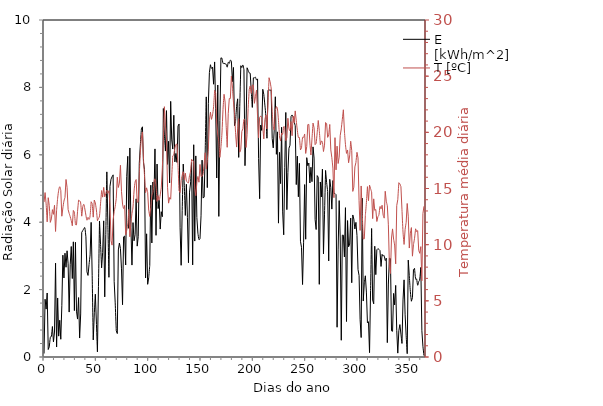
| Category | E |
|---|---|
| 1.0 | 0.103 |
| 2.0 | 1.714 |
| 3.0 | 1.421 |
| 4.0 | 1.9 |
| 5.0 | 0.222 |
| 6.0 | 0.301 |
| 7.0 | 0.579 |
| 8.0 | 0.615 |
| 9.0 | 0.905 |
| 10.0 | 0.449 |
| 11.0 | 0.74 |
| 12.0 | 2.784 |
| 13.0 | 0.296 |
| 14.0 | 1.752 |
| 15.0 | 0.619 |
| 16.0 | 1.091 |
| 17.0 | 0.527 |
| 18.0 | 1.522 |
| 19.0 | 3.022 |
| 20.0 | 2.345 |
| 21.0 | 3.08 |
| 22.0 | 2.663 |
| 23.0 | 3.152 |
| 24.0 | 2.765 |
| 25.0 | 1.333 |
| 26.0 | 2.736 |
| 27.0 | 3.279 |
| 28.0 | 2.328 |
| 29.0 | 3.418 |
| 30.0 | 1.377 |
| 31.0 | 3.404 |
| 32.0 | 1.36 |
| 33.0 | 1.125 |
| 34.0 | 1.764 |
| 35.0 | 0.563 |
| 36.0 | 1.277 |
| 37.0 | 3.698 |
| 38.0 | 3.753 |
| 39.0 | 3.804 |
| 40.0 | 3.83 |
| 41.0 | 3.566 |
| 42.0 | 2.527 |
| 43.0 | 2.421 |
| 44.0 | 2.741 |
| 45.0 | 3.03 |
| 46.0 | 3.994 |
| 47.0 | 2.412 |
| 48.0 | 0.507 |
| 49.0 | 1.278 |
| 50.0 | 1.864 |
| 51.0 | 1.039 |
| 52.0 | 0.153 |
| 53.0 | 2.093 |
| 54.0 | 4.034 |
| 55.0 | 3.34 |
| 56.0 | 2.646 |
| 57.0 | 3.095 |
| 58.0 | 4.04 |
| 59.0 | 1.784 |
| 60.0 | 3.638 |
| 61.0 | 5.493 |
| 62.0 | 3.906 |
| 63.0 | 2.365 |
| 64.0 | 5.064 |
| 65.0 | 5.274 |
| 66.0 | 5.35 |
| 67.0 | 5.405 |
| 68.0 | 2.245 |
| 69.0 | 1.607 |
| 70.0 | 0.778 |
| 71.0 | 0.695 |
| 72.0 | 3.177 |
| 73.0 | 3.383 |
| 74.0 | 3.219 |
| 75.0 | 2.616 |
| 76.0 | 1.551 |
| 77.0 | 3.566 |
| 78.0 | 3.588 |
| 79.0 | 2.73 |
| 80.0 | 5.361 |
| 81.0 | 5.955 |
| 82.0 | 3.816 |
| 83.0 | 6.203 |
| 84.0 | 3.836 |
| 85.0 | 2.727 |
| 86.0 | 3.988 |
| 87.0 | 3.448 |
| 88.0 | 3.626 |
| 89.0 | 4.694 |
| 90.0 | 3.29 |
| 91.0 | 3.572 |
| 92.0 | 5.747 |
| 93.0 | 6.291 |
| 94.0 | 6.764 |
| 95.0 | 6.831 |
| 96.0 | 5.776 |
| 97.0 | 5.557 |
| 98.0 | 2.344 |
| 99.0 | 3.655 |
| 100.0 | 2.157 |
| 101.0 | 2.354 |
| 102.0 | 2.718 |
| 103.0 | 5.098 |
| 104.0 | 3.384 |
| 105.0 | 5.191 |
| 106.0 | 4.671 |
| 107.0 | 6.175 |
| 108.0 | 3.61 |
| 109.0 | 5.725 |
| 110.0 | 4.405 |
| 111.0 | 4.651 |
| 112.0 | 3.796 |
| 113.0 | 4.312 |
| 114.0 | 4.162 |
| 115.0 | 7.374 |
| 116.0 | 6.591 |
| 117.0 | 6.111 |
| 118.0 | 7.311 |
| 119.0 | 5.715 |
| 120.0 | 6.401 |
| 121.0 | 5.167 |
| 122.0 | 7.585 |
| 123.0 | 6.442 |
| 124.0 | 6.17 |
| 125.0 | 7.173 |
| 126.0 | 5.789 |
| 127.0 | 6.039 |
| 128.0 | 5.775 |
| 129.0 | 6.854 |
| 130.0 | 6.915 |
| 131.0 | 3.833 |
| 132.0 | 2.721 |
| 133.0 | 4.343 |
| 134.0 | 5.724 |
| 135.0 | 5.096 |
| 136.0 | 4.2 |
| 137.0 | 5.126 |
| 138.0 | 4.142 |
| 139.0 | 2.797 |
| 140.0 | 4.893 |
| 141.0 | 5.162 |
| 142.0 | 5.775 |
| 143.0 | 2.732 |
| 144.0 | 6.298 |
| 145.0 | 3.44 |
| 146.0 | 5.967 |
| 147.0 | 4.14 |
| 148.0 | 3.675 |
| 149.0 | 3.486 |
| 150.0 | 3.511 |
| 151.0 | 4.189 |
| 152.0 | 5.842 |
| 153.0 | 4.716 |
| 154.0 | 4.749 |
| 155.0 | 6.144 |
| 156.0 | 7.718 |
| 157.0 | 5.026 |
| 158.0 | 7.516 |
| 159.0 | 8.439 |
| 160.0 | 8.672 |
| 161.0 | 8.567 |
| 162.0 | 8.603 |
| 163.0 | 8.094 |
| 164.0 | 8.756 |
| 165.0 | 7.38 |
| 166.0 | 5.311 |
| 167.0 | 8.071 |
| 168.0 | 4.172 |
| 169.0 | 7.011 |
| 170.0 | 8.876 |
| 171.0 | 8.866 |
| 172.0 | 8.716 |
| 173.0 | 8.716 |
| 174.0 | 8.696 |
| 175.0 | 8.689 |
| 176.0 | 8.601 |
| 177.0 | 8.745 |
| 178.0 | 8.714 |
| 179.0 | 8.809 |
| 180.0 | 8.777 |
| 181.0 | 8.17 |
| 182.0 | 8.591 |
| 183.0 | 6.865 |
| 184.0 | 6.991 |
| 185.0 | 7.432 |
| 186.0 | 7.661 |
| 187.0 | 5.923 |
| 188.0 | 7.431 |
| 189.0 | 8.643 |
| 190.0 | 8.589 |
| 191.0 | 8.665 |
| 192.0 | 8.525 |
| 193.0 | 5.677 |
| 194.0 | 6.874 |
| 195.0 | 8.582 |
| 196.0 | 8.508 |
| 197.0 | 8.433 |
| 198.0 | 8.417 |
| 199.0 | 7.889 |
| 200.0 | 7.406 |
| 201.0 | 8.283 |
| 202.0 | 8.285 |
| 203.0 | 8.301 |
| 204.0 | 8.222 |
| 205.0 | 8.252 |
| 206.0 | 5.888 |
| 207.0 | 4.697 |
| 208.0 | 6.881 |
| 209.0 | 6.722 |
| 210.0 | 7.944 |
| 211.0 | 7.791 |
| 212.0 | 7.475 |
| 213.0 | 7.118 |
| 214.0 | 6.492 |
| 215.0 | 7.917 |
| 216.0 | 7.93 |
| 217.0 | 7.914 |
| 218.0 | 7.927 |
| 219.0 | 6.483 |
| 220.0 | 6.205 |
| 221.0 | 6.778 |
| 222.0 | 7.722 |
| 223.0 | 6.015 |
| 224.0 | 6.681 |
| 225.0 | 3.972 |
| 226.0 | 6.072 |
| 227.0 | 5.145 |
| 228.0 | 6.818 |
| 229.0 | 4.306 |
| 230.0 | 3.626 |
| 231.0 | 5.627 |
| 232.0 | 7.256 |
| 233.0 | 4.372 |
| 234.0 | 5.475 |
| 235.0 | 6.194 |
| 236.0 | 6.283 |
| 237.0 | 7.136 |
| 238.0 | 7.183 |
| 239.0 | 7.125 |
| 240.0 | 6.983 |
| 241.0 | 6.862 |
| 242.0 | 5.116 |
| 243.0 | 5.961 |
| 244.0 | 4.754 |
| 245.0 | 5.747 |
| 246.0 | 3.434 |
| 247.0 | 3.254 |
| 248.0 | 2.15 |
| 249.0 | 3.406 |
| 250.0 | 5.116 |
| 251.0 | 3.495 |
| 252.0 | 5.915 |
| 253.0 | 5.676 |
| 254.0 | 5.754 |
| 255.0 | 5.163 |
| 256.0 | 5.631 |
| 257.0 | 5.202 |
| 258.0 | 6.235 |
| 259.0 | 5.903 |
| 260.0 | 4.076 |
| 261.0 | 3.783 |
| 262.0 | 5.383 |
| 263.0 | 5.332 |
| 264.0 | 2.156 |
| 265.0 | 5.193 |
| 266.0 | 4.748 |
| 267.0 | 5.576 |
| 268.0 | 3.061 |
| 269.0 | 4.239 |
| 270.0 | 5.536 |
| 271.0 | 5.175 |
| 272.0 | 4.913 |
| 273.0 | 2.851 |
| 274.0 | 5.272 |
| 275.0 | 5.026 |
| 276.0 | 4.389 |
| 277.0 | 5.236 |
| 278.0 | 4.852 |
| 279.0 | 4.852 |
| 280.0 | 4.818 |
| 281.0 | 0.883 |
| 282.0 | 3.2 |
| 283.0 | 4.641 |
| 284.0 | 3.531 |
| 285.0 | 0.497 |
| 286.0 | 3.616 |
| 287.0 | 3.616 |
| 288.0 | 2.97 |
| 289.0 | 4.431 |
| 290.0 | 1.053 |
| 291.0 | 4.049 |
| 292.0 | 3.269 |
| 293.0 | 3.352 |
| 294.0 | 4.122 |
| 295.0 | 2.203 |
| 296.0 | 4.215 |
| 297.0 | 4.092 |
| 298.0 | 3.799 |
| 299.0 | 3.996 |
| 300.0 | 3.606 |
| 301.0 | 2.595 |
| 302.0 | 2.418 |
| 303.0 | 1.106 |
| 304.0 | 0.578 |
| 305.0 | 4.713 |
| 306.0 | 1.66 |
| 307.0 | 2.203 |
| 308.0 | 2.41 |
| 309.0 | 1.926 |
| 310.0 | 1.014 |
| 311.0 | 1.047 |
| 312.0 | 0.128 |
| 313.0 | 1.971 |
| 314.0 | 3.813 |
| 315.0 | 1.691 |
| 316.0 | 1.577 |
| 317.0 | 3.286 |
| 318.0 | 2.444 |
| 319.0 | 3.181 |
| 320.0 | 3.217 |
| 321.0 | 3.193 |
| 322.0 | 3.158 |
| 323.0 | 2.687 |
| 324.0 | 3.046 |
| 325.0 | 2.993 |
| 326.0 | 3.007 |
| 327.0 | 2.863 |
| 328.0 | 2.934 |
| 329.0 | 0.426 |
| 330.0 | 2.165 |
| 331.0 | 2.929 |
| 332.0 | 2.919 |
| 333.0 | 0.777 |
| 334.0 | 0.762 |
| 335.0 | 1.887 |
| 336.0 | 1.545 |
| 337.0 | 2.125 |
| 338.0 | 0.79 |
| 339.0 | 0.115 |
| 340.0 | 0.781 |
| 341.0 | 0.962 |
| 342.0 | 0.679 |
| 343.0 | 0.402 |
| 344.0 | 1.694 |
| 345.0 | 2.289 |
| 346.0 | 1.251 |
| 347.0 | 0.631 |
| 348.0 | 0.098 |
| 349.0 | 2.876 |
| 350.0 | 2.413 |
| 351.0 | 1.944 |
| 352.0 | 1.654 |
| 353.0 | 1.761 |
| 354.0 | 2.598 |
| 355.0 | 2.63 |
| 356.0 | 2.322 |
| 357.0 | 2.313 |
| 358.0 | 2.129 |
| 359.0 | 2.238 |
| 360.0 | 2.314 |
| 361.0 | 2.658 |
| 362.0 | 0.781 |
| 363.0 | 0.319 |
| 364.0 | 0.042 |